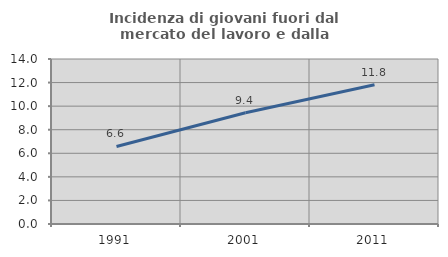
| Category | Incidenza di giovani fuori dal mercato del lavoro e dalla formazione  |
|---|---|
| 1991.0 | 6.576 |
| 2001.0 | 9.439 |
| 2011.0 | 11.81 |